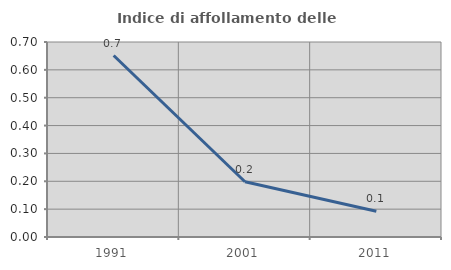
| Category | Indice di affollamento delle abitazioni  |
|---|---|
| 1991.0 | 0.651 |
| 2001.0 | 0.198 |
| 2011.0 | 0.092 |